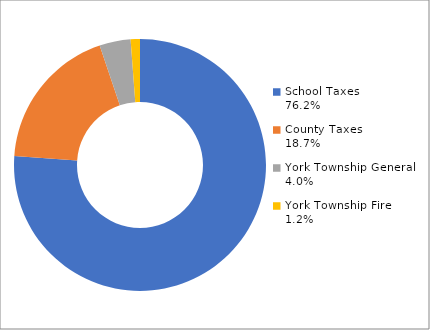
| Category | Series 0 |
|---|---|
| 0 | 3783.352 |
| 1 | 927.449 |
| 2 | 198.282 |
| 3 | 59.165 |